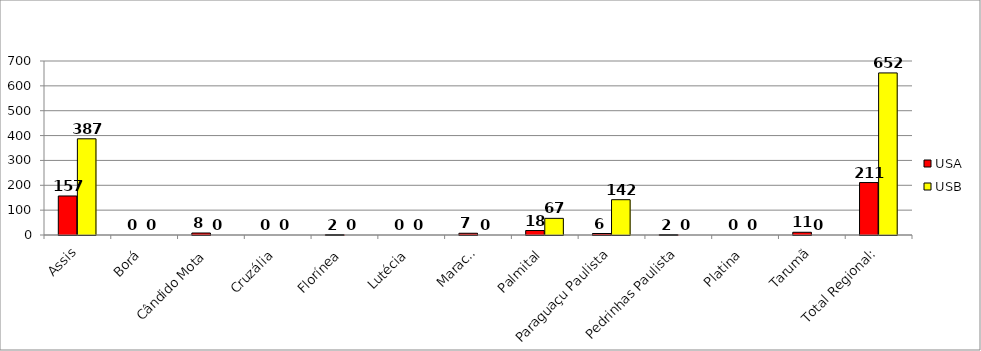
| Category | USA | USB |
|---|---|---|
| Assis | 157 | 387 |
| Borá | 0 | 0 |
| Cândido Mota | 8 | 0 |
| Cruzália | 0 | 0 |
| Florínea | 2 | 0 |
| Lutécia | 0 | 0 |
| Maracaí | 7 | 0 |
| Palmital | 18 | 67 |
| Paraguaçu Paulista | 6 | 142 |
| Pedrinhas Paulista | 2 | 0 |
| Platina | 0 | 0 |
| Tarumã | 11 | 0 |
| Total Regional: | 211 | 652 |